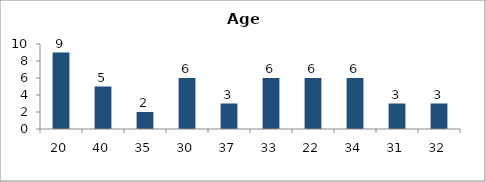
| Category | Age |
|---|---|
| 20.0 | 9 |
| 40.0 | 5 |
| 35.0 | 2 |
| 30.0 | 6 |
| 37.0 | 3 |
| 33.0 | 6 |
| 22.0 | 6 |
| 34.0 | 6 |
| 31.0 | 3 |
| 32.0 | 3 |